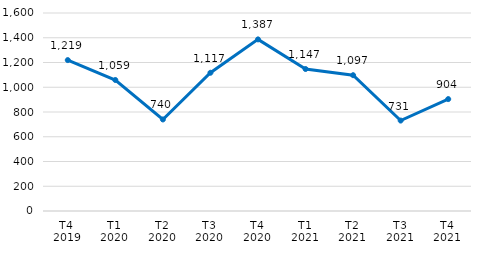
| Category | Series 0 |
|---|---|
| T4 
2019 | 1219.352 |
| T1
2020 | 1058.652 |
| T2
2020 | 739.801 |
| T3
2020 | 1117.09 |
| T4
2020 | 1386.794 |
| T1
2021 | 1147.355 |
| T2
2021 | 1097.454 |
| T3
2021 | 730.738 |
| T4
2021 | 904.347 |